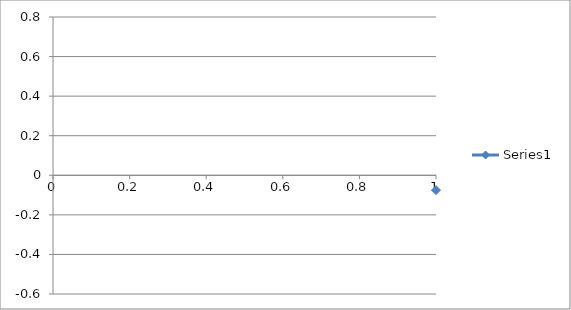
| Category | Series 0 |
|---|---|
| 0 | -0.075 |
| 1 | -0.044 |
| 2 | -0.054 |
| 3 | -0.037 |
| 4 | -0.048 |
| 5 | -0.041 |
| 6 | -0.034 |
| 7 | -0.033 |
| 8 | -0.028 |
| 9 | -0.028 |
| 10 | -0.026 |
| 11 | -0.015 |
| 12 | -0.015 |
| 13 | -0.022 |
| 14 | -0.008 |
| 15 | -0.002 |
| 16 | -0.009 |
| 17 | 0.007 |
| 18 | 0.003 |
| 19 | -0.001 |
| 20 | 0.004 |
| 21 | 0.006 |
| 22 | 0.007 |
| 23 | 0.01 |
| 24 | 0.01 |
| 25 | 0.023 |
| 26 | 0.029 |
| 27 | 0.036 |
| 28 | 0.042 |
| 29 | 0.043 |
| 30 | 0.06 |
| 31 | 0.072 |
| 32 | 0.082 |
| 33 | 0.079 |
| 34 | 0.094 |
| 35 | 0.096 |
| 36 | 0.111 |
| 37 | 0.129 |
| 38 | 0.132 |
| 39 | 0.13 |
| 40 | 0.131 |
| 41 | 0.157 |
| 42 | 0.176 |
| 43 | 0.185 |
| 44 | 0.191 |
| 45 | 0.21 |
| 46 | 0.244 |
| 47 | 0.247 |
| 48 | 0.262 |
| 49 | 0.283 |
| 50 | 0.309 |
| 51 | 0.331 |
| 52 | 0.371 |
| 53 | 0.395 |
| 54 | 0.419 |
| 55 | 0.427 |
| 56 | 0.469 |
| 57 | 0.516 |
| 58 | 0.532 |
| 59 | 0.569 |
| 60 | 0.594 |
| 61 | 0.629 |
| 62 | 0.639 |
| 63 | 0.649 |
| 64 | 0.653 |
| 65 | 0.668 |
| 66 | 0.664 |
| 67 | 0.677 |
| 68 | 0.659 |
| 69 | 0.644 |
| 70 | 0.599 |
| 71 | 0.583 |
| 72 | 0.557 |
| 73 | 0.526 |
| 74 | 0.503 |
| 75 | 0.451 |
| 76 | 0.421 |
| 77 | 0.346 |
| 78 | 0.277 |
| 79 | 0.213 |
| 80 | 0.172 |
| 81 | 0.081 |
| 82 | 0.009 |
| 83 | -0.062 |
| 84 | -0.124 |
| 85 | -0.168 |
| 86 | -0.248 |
| 87 | -0.263 |
| 88 | -0.316 |
| 89 | -0.347 |
| 90 | -0.355 |
| 91 | -0.37 |
| 92 | -0.385 |
| 93 | -0.413 |
| 94 | -0.428 |
| 95 | -0.438 |
| 96 | -0.43 |
| 97 | -0.428 |
| 98 | -0.419 |
| 99 | -0.413 |
| 100 | -0.403 |
| 101 | -0.373 |
| 102 | -0.347 |
| 103 | -0.33 |
| 104 | -0.305 |
| 105 | -0.261 |
| 106 | -0.242 |
| 107 | -0.219 |
| 108 | -0.177 |
| 109 | -0.154 |
| 110 | -0.125 |
| 111 | -0.099 |
| 112 | -0.09 |
| 113 | -0.062 |
| 114 | -0.037 |
| 115 | -0.013 |
| 116 | -0.003 |
| 117 | 0.026 |
| 118 | 0.035 |
| 119 | 0.044 |
| 120 | 0.058 |
| 121 | 0.067 |
| 122 | 0.066 |
| 123 | 0.09 |
| 124 | 0.093 |
| 125 | 0.113 |
| 126 | 0.138 |
| 127 | 0.136 |
| 128 | 0.131 |
| 129 | 0.133 |
| 130 | 0.14 |
| 131 | 0.15 |
| 132 | 0.156 |
| 133 | 0.169 |
| 134 | 0.176 |
| 135 | 0.172 |
| 136 | 0.179 |
| 137 | 0.2 |
| 138 | 0.217 |
| 139 | 0.225 |
| 140 | 0.224 |
| 141 | 0.224 |
| 142 | 0.221 |
| 143 | 0.219 |
| 144 | 0.228 |
| 145 | 0.24 |
| 146 | 0.25 |
| 147 | 0.258 |
| 148 | 0.254 |
| 149 | 0.252 |
| 150 | 0.263 |
| 151 | 0.26 |
| 152 | 0.266 |
| 153 | 0.265 |
| 154 | 0.27 |
| 155 | 0.274 |
| 156 | 0.263 |
| 157 | 0.276 |
| 158 | 0.27 |
| 159 | 0.28 |
| 160 | 0.285 |